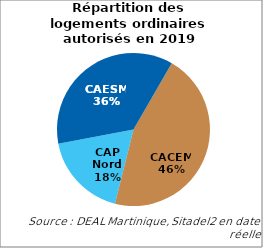
| Category | Series 2 |
|---|---|
| CACEM | 1012 |
| CAP Nord | 403 |
| CAESM | 806 |